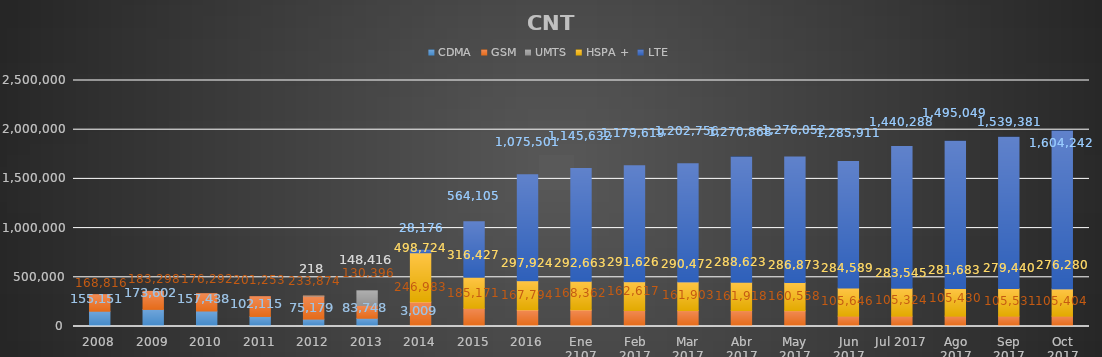
| Category | CDMA | GSM | UMTS | HSPA + | LTE |
|---|---|---|---|---|---|
| 2008 | 155151 | 168816 | 0 | 0 | 0 |
| 2009 | 173602 | 183298 | 0 | 0 | 0 |
| 2010 | 157438 | 176292 | 0 | 0 | 0 |
| 2011 | 102115 | 201253 | 0 | 0 | 0 |
| 2012 | 75179 | 233874 | 218 | 0 | 0 |
| 2013 | 83748 | 130396 | 148416 | 0 | 0 |
| 2014 | 3009 | 246983 | 0 | 498724 | 28176 |
| 2015 | 0 | 185171 | 0 | 316427 | 564105 |
| 2016 | 0 | 167794 | 0 | 297924 | 1075501 |
| Ene 2107 | 0 | 168362 | 0 | 292663 | 1145632 |
| Feb 2017 | 0 | 162617 | 0 | 291626 | 1179619 |
| Mar 2017 | 0 | 161903 | 0 | 290472 | 1202756 |
| Abr 2017 | 0 | 161918 | 0 | 288623 | 1270868 |
| May 2017 | 0 | 160558 | 0 | 286873 | 1276052 |
| Jun 2017 | 0 | 105646 | 0 | 284589 | 1285911 |
| Jul 2017 | 0 | 105324 | 0 | 283545 | 1440288 |
| Ago 2017 | 0 | 105430 | 0 | 281683 | 1495049 |
| Sep 2017 | 0 | 105531 | 0 | 279440 | 1539381 |
| Oct 2017 | 0 | 105404 | 0 | 276280 | 1604242 |